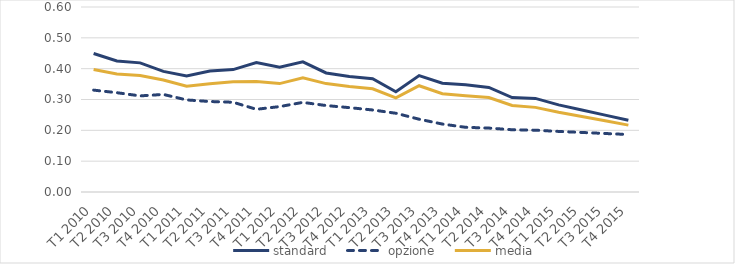
| Category | standard | opzione | media |
|---|---|---|---|
| T1 2010 | 0.449 | 0.33 | 0.397 |
| T2 2010 | 0.425 | 0.322 | 0.382 |
| T3 2010 | 0.419 | 0.312 | 0.378 |
| T4 2010 | 0.391 | 0.316 | 0.363 |
| T1 2011 | 0.376 | 0.299 | 0.343 |
| T2 2011 | 0.392 | 0.293 | 0.351 |
| T3 2011 | 0.397 | 0.291 | 0.357 |
| T4 2011 | 0.42 | 0.268 | 0.358 |
| T1 2012 | 0.405 | 0.277 | 0.352 |
| T2 2012 | 0.422 | 0.291 | 0.37 |
| T3 2012 | 0.386 | 0.28 | 0.352 |
| T4 2012 | 0.375 | 0.274 | 0.342 |
| T1 2013 | 0.367 | 0.266 | 0.335 |
| T2 2013 | 0.325 | 0.255 | 0.305 |
| T3 2013 | 0.378 | 0.236 | 0.345 |
| T4 2013 | 0.353 | 0.22 | 0.319 |
| T1 2014 | 0.348 | 0.21 | 0.312 |
| T2 2014 | 0.339 | 0.207 | 0.306 |
| T3 2014 | 0.306 | 0.202 | 0.281 |
| T4 2014 | 0.304 | 0.2 | 0.274 |
| T1 2015 | 0.283 | 0.196 | 0.259 |
| T2 2015 | 0.266 | 0.193 | 0.245 |
| T3 2015 | 0.249 | 0.19 | 0.231 |
| T4 2015 | 0.233 | 0.186 | 0.217 |